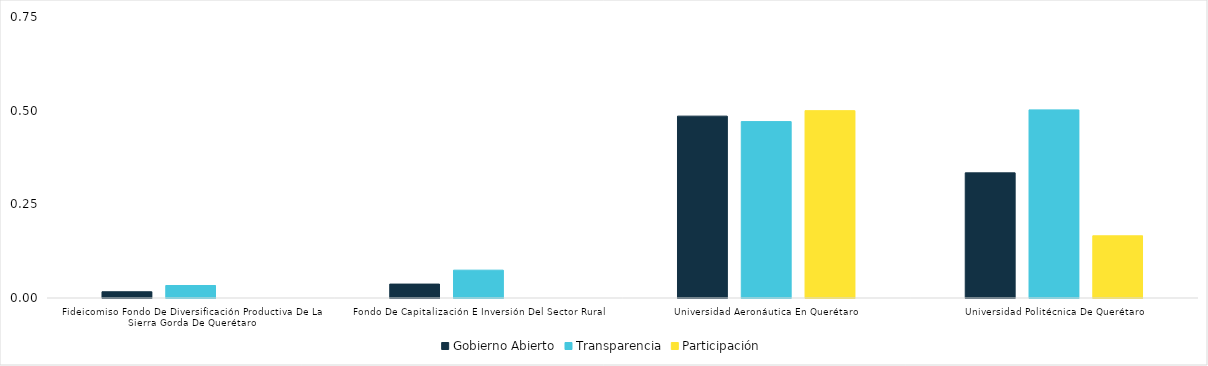
| Category | Gobierno Abierto | Transparencia | Participación |
|---|---|---|---|
| Fideicomiso Fondo De Diversificación Productiva De La Sierra Gorda De Querétaro | 0.017 | 0.033 | 0 |
| Fondo De Capitalización E Inversión Del Sector Rural | 0.037 | 0.074 | 0 |
| Universidad Aeronáutica En Querétaro | 0.485 | 0.471 | 0.5 |
| Universidad Politécnica De Querétaro | 0.334 | 0.502 | 0.166 |